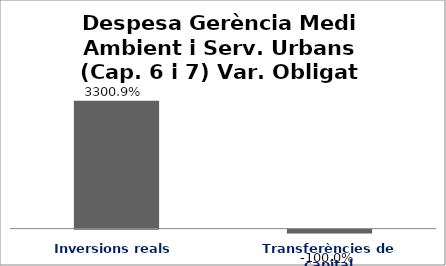
| Category | Series 0 |
|---|---|
| Inversions reals | 33.009 |
| Transferències de capital | -1 |